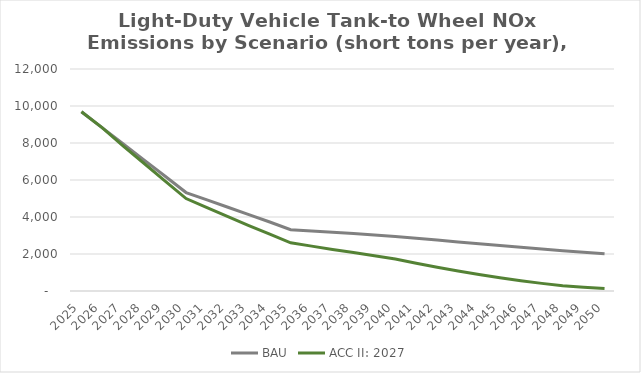
| Category | BAU | ACC II: 2027 |
|---|---|---|
| 2025.0 | 9687.834 | 9687.834 |
| 2026.0 | 8814.88 | 8814.88 |
| 2027.0 | 7945.303 | 7831.646 |
| 2028.0 | 7074.085 | 6891.052 |
| 2029.0 | 6200.239 | 5941.793 |
| 2030.0 | 5321.406 | 4995.824 |
| 2031.0 | 4925.404 | 4507.136 |
| 2032.0 | 4527.555 | 4018.572 |
| 2033.0 | 4128.595 | 3537.927 |
| 2034.0 | 3728.578 | 3068.477 |
| 2035.0 | 3314.78 | 2605.049 |
| 2036.0 | 3246.82 | 2424.875 |
| 2037.0 | 3176.494 | 2248.788 |
| 2038.0 | 3103.481 | 2077.23 |
| 2039.0 | 3028.47 | 1910.827 |
| 2040.0 | 2950.085 | 1726.329 |
| 2041.0 | 2851.688 | 1501.933 |
| 2042.0 | 2752.359 | 1284.919 |
| 2043.0 | 2652.258 | 1084.738 |
| 2044.0 | 2553.87 | 892.238 |
| 2045.0 | 2458.081 | 715.955 |
| 2046.0 | 2363.721 | 552.894 |
| 2047.0 | 2271.178 | 411.988 |
| 2048.0 | 2180.26 | 288.75 |
| 2049.0 | 2093.03 | 204.926 |
| 2050.0 | 2008.182 | 134.52 |